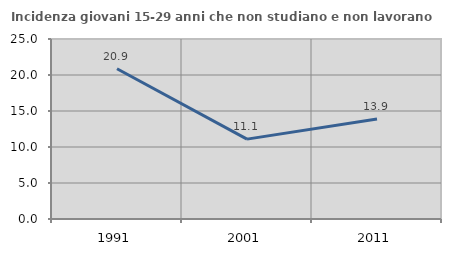
| Category | Incidenza giovani 15-29 anni che non studiano e non lavorano  |
|---|---|
| 1991.0 | 20.872 |
| 2001.0 | 11.093 |
| 2011.0 | 13.895 |